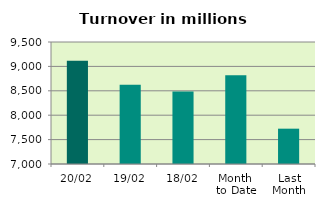
| Category | Series 0 |
|---|---|
| 20/02 | 9115.377 |
| 19/02 | 8625.623 |
| 18/02 | 8485.638 |
| Month 
to Date | 8819.264 |
| Last
Month | 7723.751 |